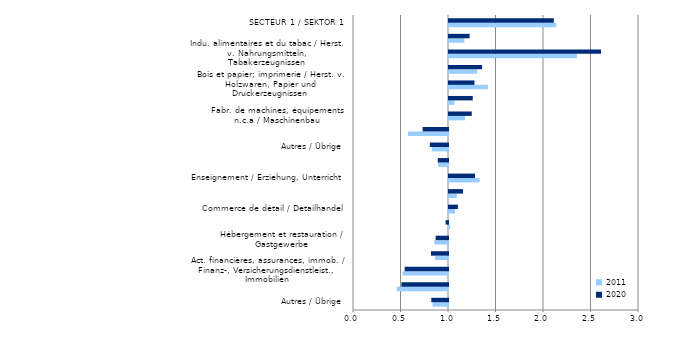
| Category | 2011 | 2020 |
|---|---|---|
| Autres / Übrige | 0.837 | 0.824 |
| Informatique et information / Informationstechnolog., -dienstleistungen | 0.459 | 0.51 |
| Act. financières, assurances, immob. / Finanz-, Versicherungsdienstleist., Immobilien | 0.521 | 0.544 |
| Autres act. spécialisées, scient., tech. / Sonstige freiberufl., wiss., techn. Dienstleist. | 0.863 | 0.82 |
| Hébergement et restauration / Gastgewerbe | 0.856 | 0.87 |
| Santé humaine et action sociale / Gesundheits-, Sozialwesen | 1.012 | 0.975 |
| Commerce de détail / Detailhandel | 1.063 | 1.094 |
| Administration publique / Öffentliche Verwaltung | 1.081 | 1.148 |
| Enseignement / Erziehung, Unterricht | 1.323 | 1.274 |
| SECTEUR 3 / SEKTOR 3 | 0.895 | 0.892 |
| Autres / Übrige | 0.828 | 0.809 |
| Indu. chimique et pharma. / Chemische und pharmazeutische Erzeugnisse | 0.578 | 0.733 |
| Fabr. de machines, équipements n.c.a / Maschinenbau | 1.168 | 1.24 |
| Fabrication de produits métalliques / Herst. v. Metallerzeugnissen | 1.058 | 1.25 |
| Bois et papier; imprimerie / Herst. v. Holzwaren, Papier und Druckerzeugnissen | 1.41 | 1.268 |
| Construction / Baugewerbe | 1.298 | 1.348 |
| Indu. alimentaires et du tabac / Herst. v. Nahrungsmitteln, Tabakerzeugnissen | 2.347 | 2.6 |
| SECTEUR 2 / SEKTOR 2 | 1.161 | 1.217 |
| SECTEUR 1 / SEKTOR 1 | 2.128 | 2.103 |